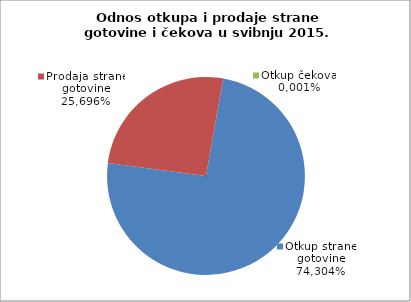
| Category | Otkup strane gotovine |
|---|---|
| 0 | 0.743 |
| 1 | 0.257 |
| 2 | 0 |